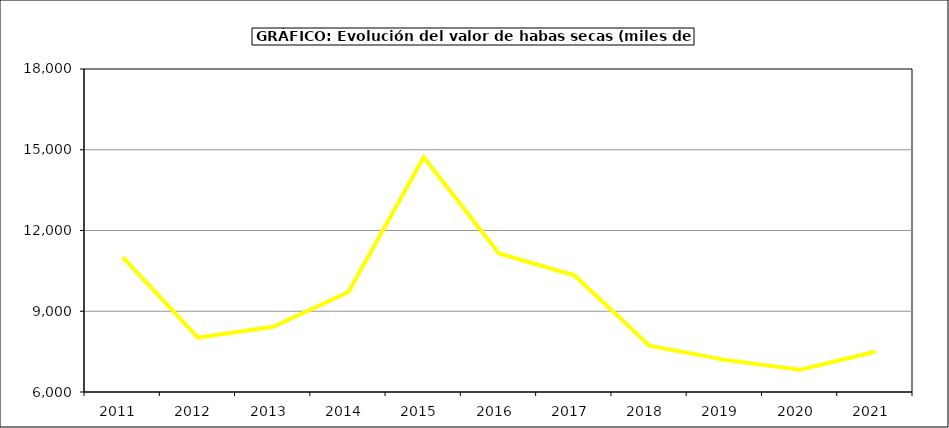
| Category | Valor |
|---|---|
| 2011.0 | 11007.809 |
| 2012.0 | 8020.102 |
| 2013.0 | 8422.081 |
| 2014.0 | 9715.78 |
| 2015.0 | 14725 |
| 2016.0 | 11148.6 |
| 2017.0 | 10333.378 |
| 2018.0 | 7717.975 |
| 2019.0 | 7193.25 |
| 2020.0 | 6824.697 |
| 2021.0 | 7494.799 |